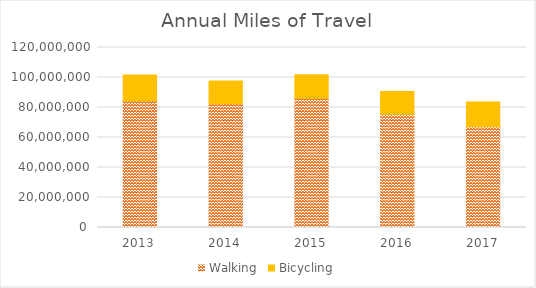
| Category | Walking | Bicycling |
|---|---|---|
| 2013 | 84265665.778 | 17400342.338 |
| 2014 | 82505141.248 | 15210255.038 |
| 2015 | 86115318.266 | 15652622.707 |
| 2016 | 75442437.957 | 15297789.962 |
| 2017 | 67245194.535 | 16394095.247 |